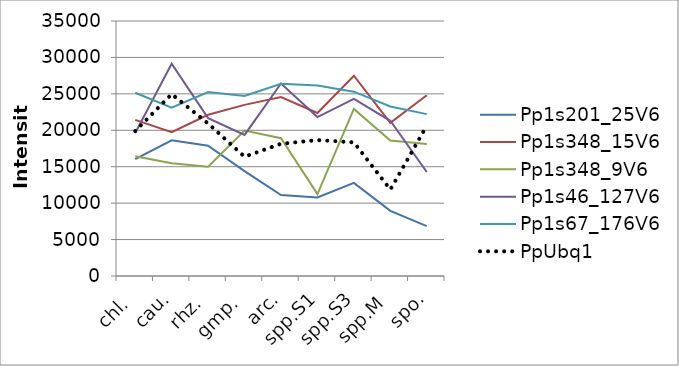
| Category | Pp1s201_25V6 | Pp1s348_15V6 | Pp1s348_9V6 | Pp1s46_127V6 | Pp1s67_176V6 | PpUbq1 |
|---|---|---|---|---|---|---|
| chl. | 16054.7 | 21434.5 | 16437.09 | 19618.5 | 25158.7 | 19893.7 |
| cau. | 18624.7 | 19741.4 | 15461.2 | 29136.9 | 23108.6 | 24963.3 |
| rhz. | 17876.5 | 22131.5 | 14987.6 | 21662.3 | 25252.8 | 20931.4 |
| gmp. | 14396.3 | 23490 | 19965.5 | 19363.2 | 24714.2 | 16371.5 |
| arc. | 11113.1 | 24569 | 18914.59 | 26419.8 | 26383 | 18146 |
| spp.S1 | 10773.5 | 22373.7 | 11243.3 | 21820.7 | 26136 | 18655.59 |
| spp.S3 | 12785.2 | 27485 | 22928.6 | 24316.9 | 25298.4 | 18345.9 |
| spp.M | 8944.95 | 21014.5 | 18583.4 | 21305.8 | 23275.8 | 11864.2 |
| spo. | 6855.94 | 24808.3 | 18131.5 | 14277.3 | 22219.8 | 20640.8 |